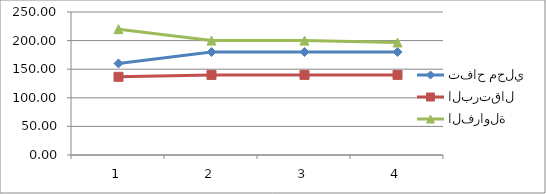
| Category | تفاح محلي | البرتقال | الفراولة |
|---|---|---|---|
| 0 | 160 | 136.67 | 220 |
| 1 | 180 | 140 | 200 |
| 2 | 180 | 140 | 200 |
| 3 | 180 | 140 | 196.67 |